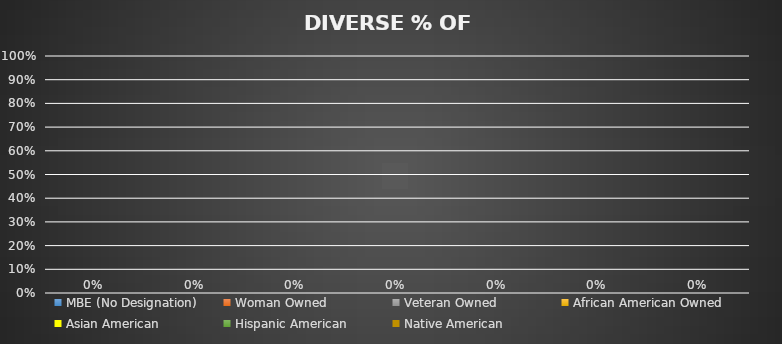
| Category | MBE (No Designation) | Woman Owned | Veteran Owned | African American Owned | Asian American | Hispanic American | Native American |
|---|---|---|---|---|---|---|---|
| 0 | 0 | 0 | 0 | 0 | 0 | 0 | 0 |